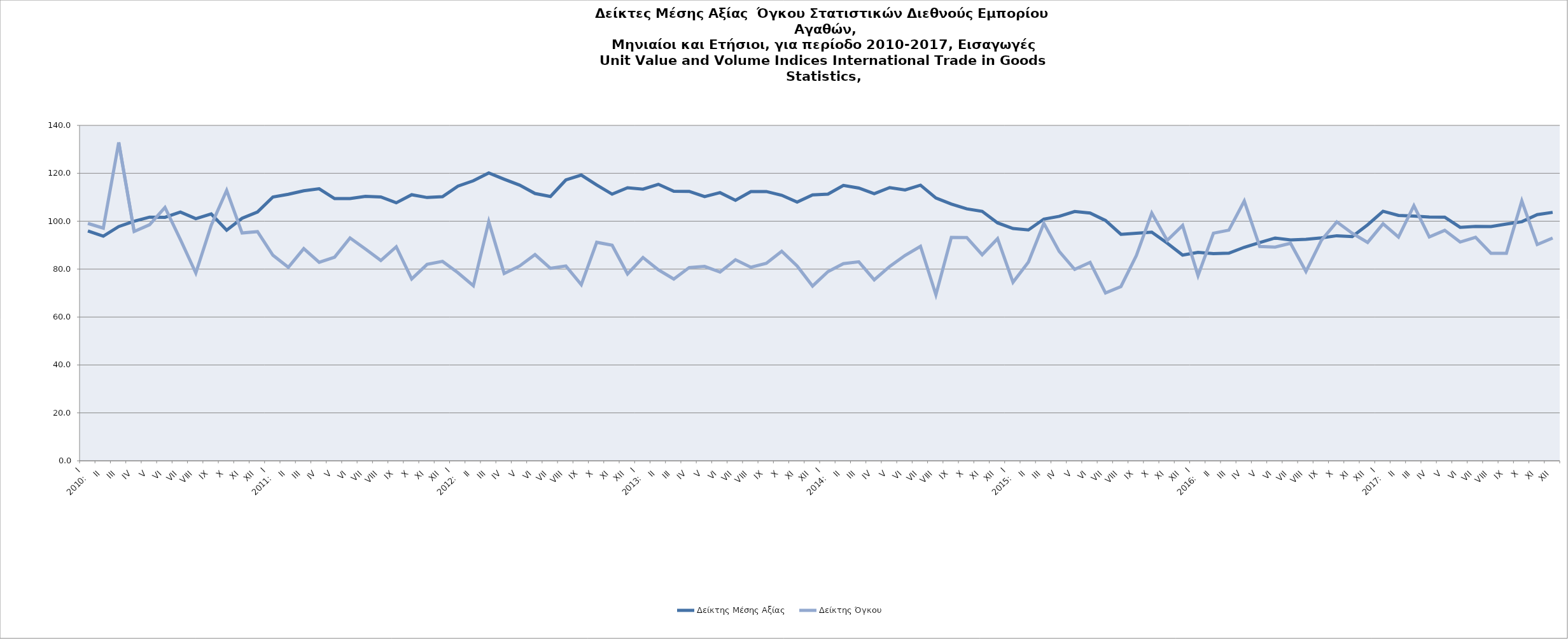
| Category | Δείκτης Μέσης Αξίας


Unit Value Index  | Δείκτης Όγκου


Volume Index |
|---|---|---|
| 0 | 95.926 | 99.085 |
| 1 | 93.748 | 97.12 |
| 2 | 97.762 | 132.9 |
| 3 | 100 | 95.701 |
| 4 | 101.691 | 98.522 |
| 5 | 101.631 | 105.754 |
| 6 | 103.842 | 92.339 |
| 7 | 101.047 | 78.381 |
| 8 | 103.03 | 98.318 |
| 9 | 96.266 | 112.873 |
| 10 | 101.221 | 95.088 |
| 11 | 103.837 | 95.648 |
| 12 | 110.111 | 85.781 |
| 13 | 111.252 | 80.767 |
| 14 | 112.713 | 88.561 |
| 15 | 113.557 | 82.824 |
| 16 | 109.431 | 85.006 |
| 17 | 109.477 | 93.024 |
| 18 | 110.4 | 88.38 |
| 19 | 110.146 | 83.604 |
| 20 | 107.688 | 89.33 |
| 21 | 111.064 | 75.881 |
| 22 | 109.887 | 81.981 |
| 23 | 110.223 | 83.251 |
| 24 | 114.657 | 78.503 |
| 25 | 116.883 | 73.047 |
| 26 | 120.156 | 99.827 |
| 27 | 117.532 | 78.163 |
| 28 | 115.066 | 81.303 |
| 29 | 111.558 | 86.069 |
| 30 | 110.307 | 80.337 |
| 31 | 117.236 | 81.321 |
| 32 | 119.273 | 73.489 |
| 33 | 115.146 | 91.202 |
| 34 | 111.292 | 89.985 |
| 35 | 113.968 | 77.977 |
| 36 | 113.372 | 84.848 |
| 37 | 115.403 | 79.692 |
| 38 | 112.519 | 75.844 |
| 39 | 112.462 | 80.66 |
| 40 | 110.281 | 81.128 |
| 41 | 111.923 | 78.765 |
| 42 | 108.744 | 83.92 |
| 43 | 112.377 | 80.778 |
| 44 | 112.396 | 82.443 |
| 45 | 110.843 | 87.458 |
| 46 | 107.985 | 81.312 |
| 47 | 110.978 | 72.942 |
| 48 | 111.312 | 78.959 |
| 49 | 114.962 | 82.306 |
| 50 | 113.843 | 83.061 |
| 51 | 111.506 | 75.551 |
| 52 | 114.038 | 81.133 |
| 53 | 113.074 | 85.737 |
| 54 | 115.051 | 89.524 |
| 55 | 109.684 | 69.285 |
| 56 | 107.161 | 93.226 |
| 57 | 105.162 | 93.203 |
| 58 | 104.111 | 86.015 |
| 59 | 99.307 | 92.721 |
| 60 | 96.952 | 74.492 |
| 61 | 96.369 | 82.958 |
| 62 | 100.877 | 99.13 |
| 63 | 102.031 | 87.378 |
| 64 | 104.048 | 79.89 |
| 65 | 103.411 | 82.841 |
| 66 | 100.314 | 70.057 |
| 67 | 94.526 | 72.732 |
| 68 | 94.966 | 85.661 |
| 69 | 95.441 | 103.436 |
| 70 | 90.849 | 91.985 |
| 71 | 85.868 | 98.235 |
| 72 | 86.983 | 77.28 |
| 73 | 86.499 | 95.02 |
| 74 | 86.647 | 96.269 |
| 75 | 89.117 | 108.41 |
| 76 | 91.108 | 89.446 |
| 77 | 92.994 | 89.214 |
| 78 | 92.161 | 90.797 |
| 79 | 92.449 | 79.013 |
| 80 | 93.045 | 92.004 |
| 81 | 93.938 | 99.726 |
| 82 | 93.591 | 94.98 |
| 83 | 98.508 | 91.131 |
| 84 | 104.149 | 98.926 |
| 85 | 102.428 | 93.377 |
| 86 | 102.151 | 106.49 |
| 87 | 101.743 | 93.422 |
| 88 | 101.705 | 96.204 |
| 89 | 97.442 | 91.309 |
| 90 | 97.847 | 93.307 |
| 91 | 97.744 | 86.592 |
| 92 | 98.814 | 86.597 |
| 93 | 99.784 | 108.471 |
| 94 | 102.766 | 90.274 |
| 95 | 103.71 | 92.994 |